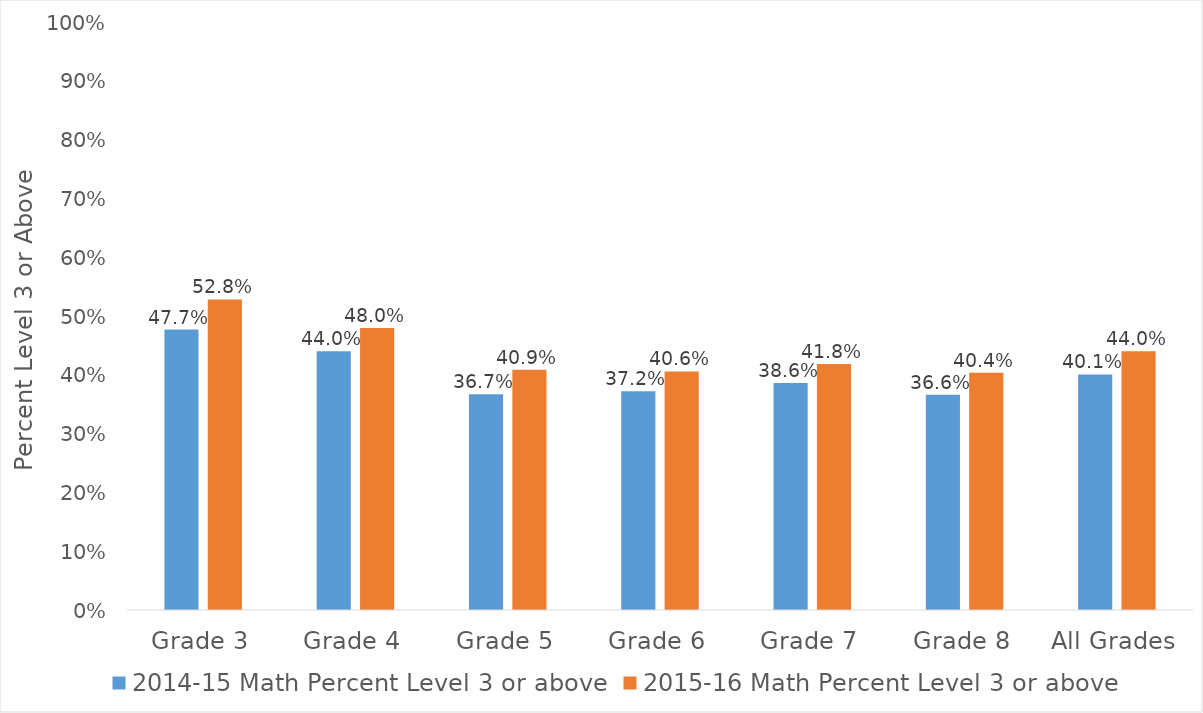
| Category | 2014-15 Math Percent Level 3 or above | 2015-16 Math Percent Level 3 or above |
|---|---|---|
| Grade 3 | 0.477 | 0.528 |
| Grade 4 | 0.44 | 0.48 |
| Grade 5 | 0.367 | 0.409 |
| Grade 6 | 0.372 | 0.406 |
| Grade 7 | 0.386 | 0.418 |
| Grade 8 | 0.366 | 0.404 |
| All Grades | 0.401 | 0.44 |